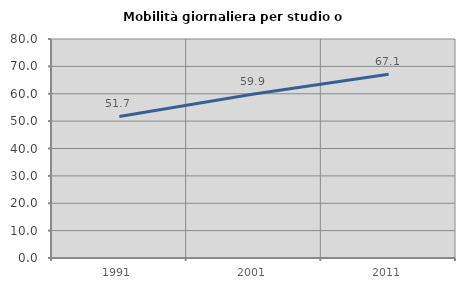
| Category | Mobilità giornaliera per studio o lavoro |
|---|---|
| 1991.0 | 51.694 |
| 2001.0 | 59.905 |
| 2011.0 | 67.091 |